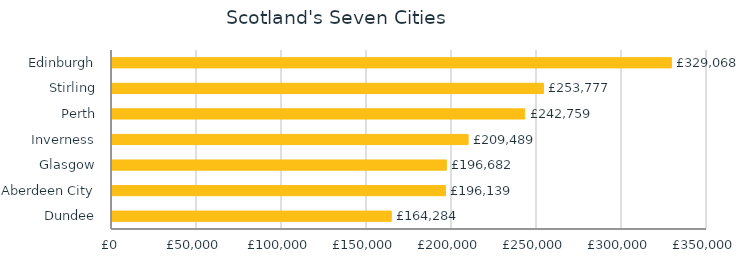
| Category | Series 0 |
|---|---|
| Dundee | 164283.705 |
| Aberdeen City | 196139.227 |
| Glasgow | 196682.415 |
| Inverness | 209489.007 |
| Perth | 242758.628 |
| Stirling | 253776.967 |
| Edinburgh | 329067.843 |